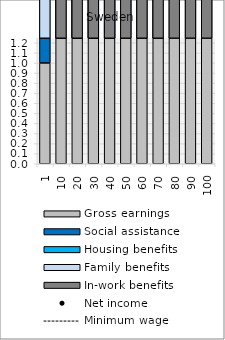
| Category | Gross earnings | Social assistance | Housing benefits | Family benefits | In-work benefits |
|---|---|---|---|---|---|
| 1.0 | 1 | 23.807 | 18.434 | 6.52 | 0 |
| 10.0 | 10 | 16.728 | 16.571 | 6.52 | 1.691 |
| 20.0 | 20 | 11.092 | 14.362 | 6.52 | 2.158 |
| 30.0 | 30 | 6.295 | 11.313 | 6.52 | 2.625 |
| 40.0 | 40 | 2.368 | 7.993 | 6.52 | 3.302 |
| 50.0 | 50 | 0 | 4.926 | 6.52 | 3.974 |
| 60.0 | 60 | 0 | 2.898 | 6.52 | 4.653 |
| 70.0 | 70 | 0 | 0.869 | 6.52 | 5.325 |
| 80.0 | 80 | 0 | 0 | 6.52 | 6.005 |
| 90.0 | 90 | 0 | 0 | 6.52 | 6.396 |
| 100.0 | 100 | 0 | 0 | 6.52 | 6.396 |